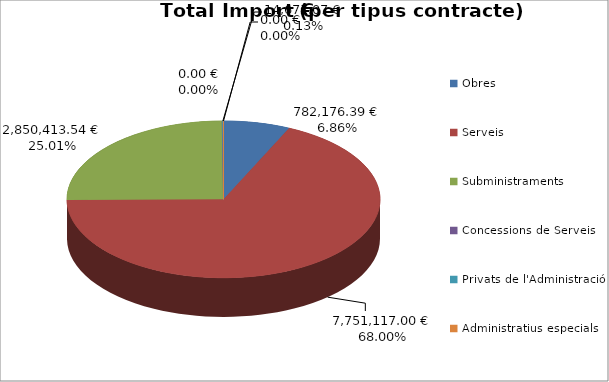
| Category | Total preu              (amb iva) |
|---|---|
| Obres | 782176.39 |
| Serveis | 7751117 |
| Subministraments | 2850413.54 |
| Concessions de Serveis | 0 |
| Privats de l'Administració | 14671.07 |
| Administratius especials | 0 |